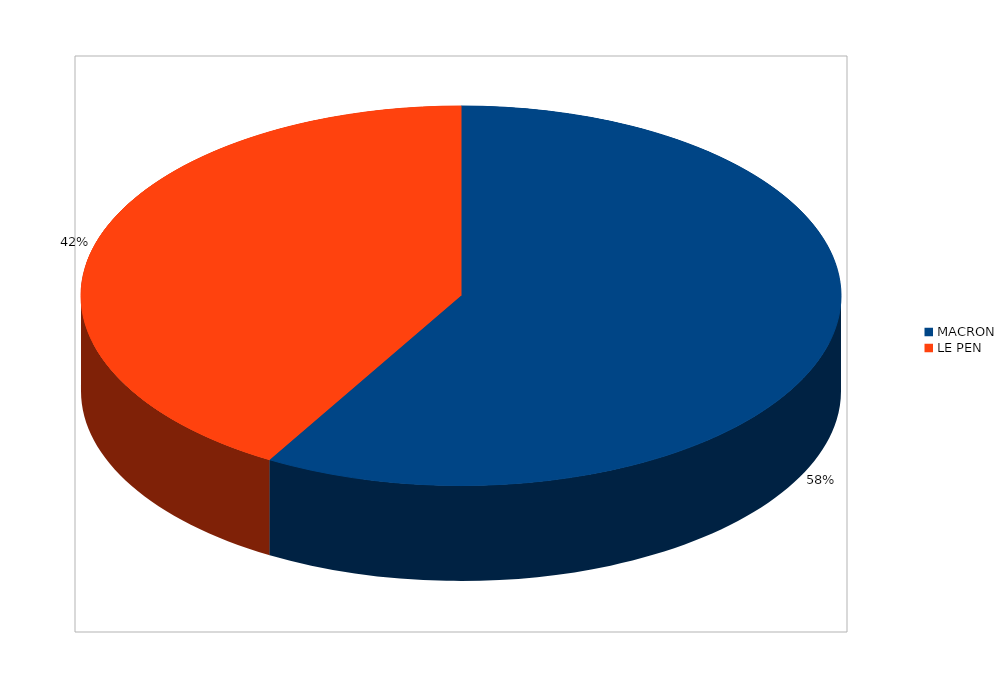
| Category | Series 0 |
|---|---|
| MACRON | 52378 |
| LE PEN | 37319 |